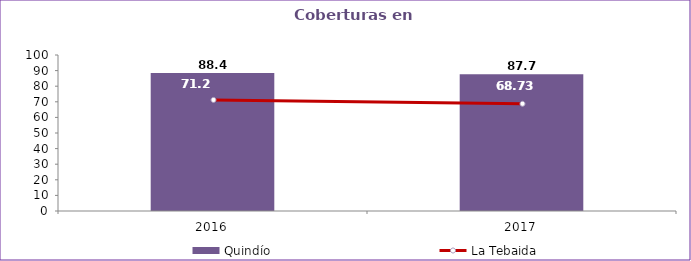
| Category | Quindío |
|---|---|
| 2016.0 | 88.4 |
| 2017.0 | 87.7 |